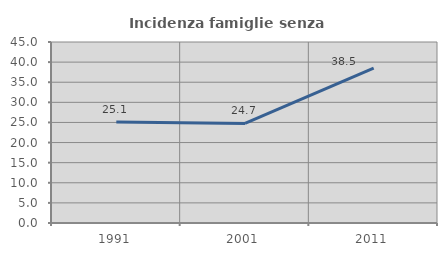
| Category | Incidenza famiglie senza nuclei |
|---|---|
| 1991.0 | 25.122 |
| 2001.0 | 24.745 |
| 2011.0 | 38.514 |